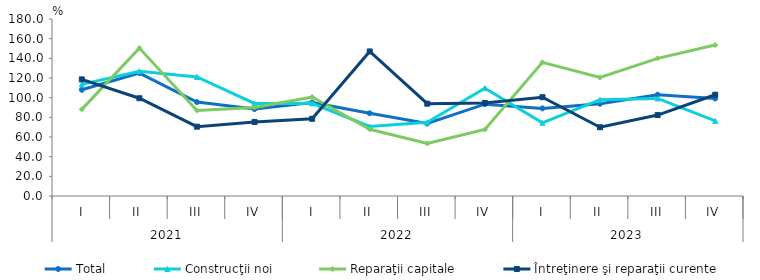
| Category | Total | Construcţii noi | Reparaţii capitale | Întreţinere şi reparaţii curente |
|---|---|---|---|---|
| 0 | 108 | 113.5 | 88.1 | 118.6 |
| 1 | 125 | 126.9 | 150.4 | 99.4 |
| 2 | 95.5 | 121.1 | 86.9 | 70.5 |
| 3 | 88.4 | 94.1 | 90.1 | 75.3 |
| 4 | 95.1 | 94.2 | 100.7 | 78.5 |
| 5 | 84.1 | 70.7 | 67.8 | 147 |
| 6 | 73.7 | 74.9 | 53.4 | 93.9 |
| 7 | 93.4 | 109.7 | 67.6 | 94.6 |
| 8 | 89.1 | 74.4 | 135.9 | 100.5 |
| 9 | 93.8 | 97.9 | 120.5 | 69.9 |
| 10 | 103 | 99.2 | 140 | 82.3 |
| 11 | 99.2 | 76.4 | 153.5 | 103 |